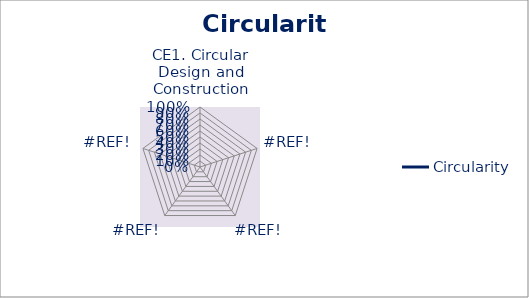
| Category | Circularity |
|---|---|
| CE1. Circular Design and Construction | 0 |
| #REF! | 0 |
| #REF! | 0 |
| #REF! | 0 |
| #REF! | 0 |